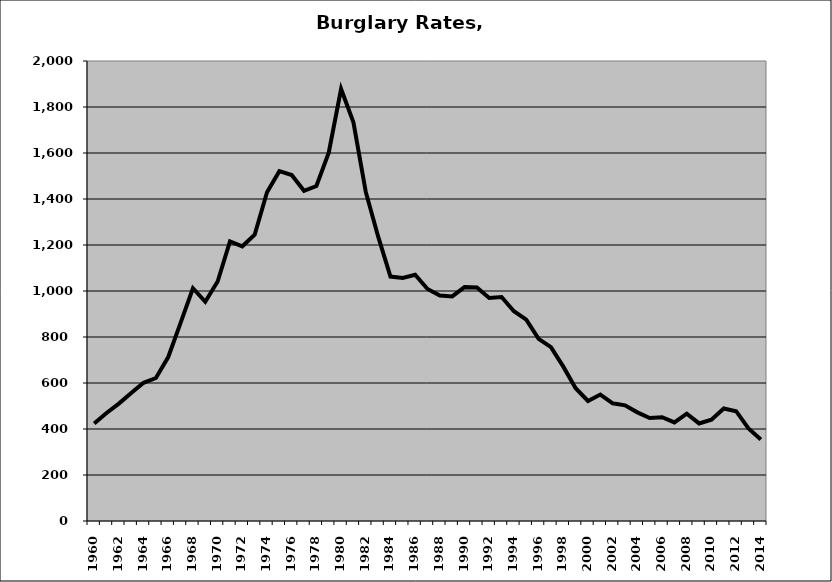
| Category | Burglary |
|---|---|
| 1960.0 | 423.585 |
| 1961.0 | 469.715 |
| 1962.0 | 510.296 |
| 1963.0 | 556.306 |
| 1964.0 | 600.763 |
| 1965.0 | 621.686 |
| 1966.0 | 712.902 |
| 1967.0 | 861.359 |
| 1968.0 | 1011.882 |
| 1969.0 | 953.036 |
| 1970.0 | 1041.396 |
| 1971.0 | 1215.342 |
| 1972.0 | 1194.258 |
| 1973.0 | 1244.518 |
| 1974.0 | 1429.386 |
| 1975.0 | 1521.159 |
| 1976.0 | 1504.171 |
| 1977.0 | 1435.789 |
| 1978.0 | 1456.258 |
| 1979.0 | 1601.487 |
| 1980.0 | 1878.193 |
| 1981.0 | 1733.198 |
| 1982.0 | 1430.734 |
| 1983.0 | 1237.159 |
| 1984.0 | 1062.821 |
| 1985.0 | 1056.903 |
| 1986.0 | 1070.801 |
| 1987.0 | 1008.759 |
| 1988.0 | 980.246 |
| 1989.0 | 976.577 |
| 1990.0 | 1017.155 |
| 1991.0 | 1015.735 |
| 1992.0 | 969.418 |
| 1993.0 | 973.956 |
| 1994.0 | 911.867 |
| 1995.0 | 875.179 |
| 1996.0 | 791.925 |
| 1997.0 | 756.165 |
| 1998.0 | 671.091 |
| 1999.0 | 577.129 |
| 2000.0 | 522.013 |
| 2001.0 | 550.01 |
| 2002.0 | 511.927 |
| 2003.0 | 502.834 |
| 2004.0 | 472.415 |
| 2005.0 | 447.884 |
| 2006.0 | 451.301 |
| 2007.0 | 428.417 |
| 2008.0 | 466.353 |
| 2009.0 | 424.278 |
| 2010.0 | 440.542 |
| 2011.0 | 489.407 |
| 2012.0 | 477.438 |
| 2013.0 | 402.659 |
| 2014.0 | 354.77 |